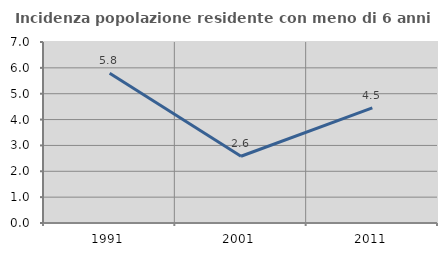
| Category | Incidenza popolazione residente con meno di 6 anni |
|---|---|
| 1991.0 | 5.794 |
| 2001.0 | 2.581 |
| 2011.0 | 4.453 |